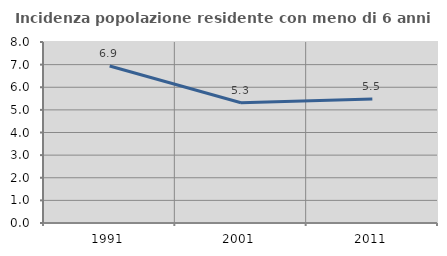
| Category | Incidenza popolazione residente con meno di 6 anni |
|---|---|
| 1991.0 | 6.939 |
| 2001.0 | 5.317 |
| 2011.0 | 5.484 |